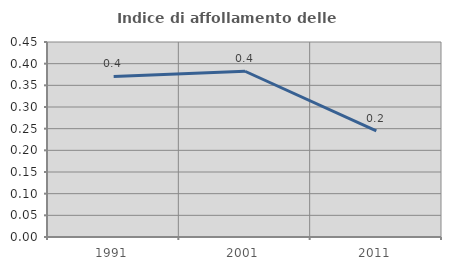
| Category | Indice di affollamento delle abitazioni  |
|---|---|
| 1991.0 | 0.371 |
| 2001.0 | 0.382 |
| 2011.0 | 0.245 |